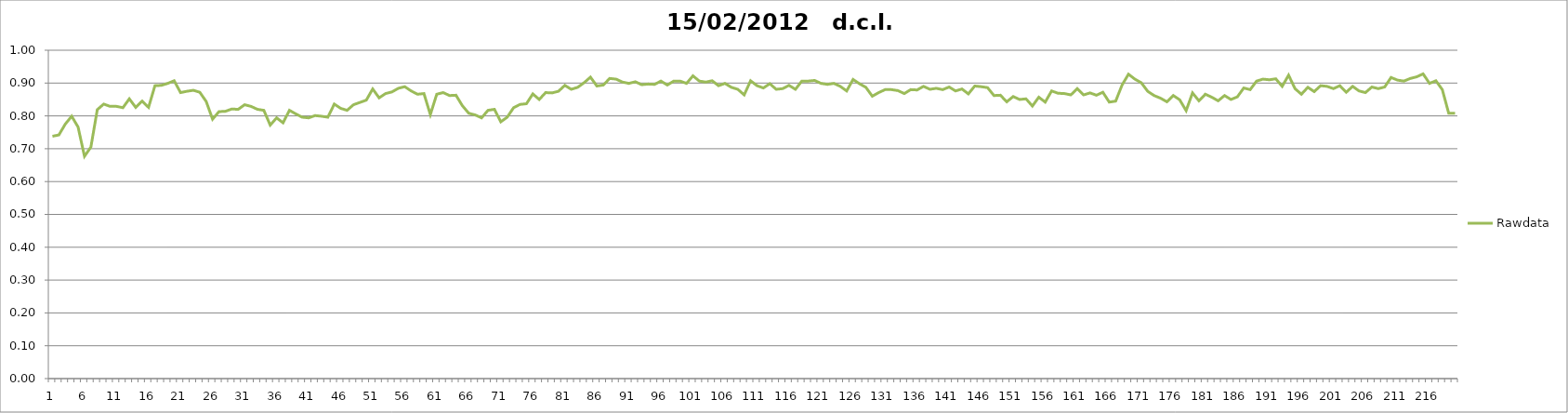
| Category | Rawdata |
|---|---|
| 0 | 0.738 |
| 1 | 0.742 |
| 2 | 0.775 |
| 3 | 0.799 |
| 4 | 0.766 |
| 5 | 0.677 |
| 6 | 0.705 |
| 7 | 0.819 |
| 8 | 0.836 |
| 9 | 0.829 |
| 10 | 0.829 |
| 11 | 0.825 |
| 12 | 0.852 |
| 13 | 0.826 |
| 14 | 0.845 |
| 15 | 0.826 |
| 16 | 0.892 |
| 17 | 0.893 |
| 18 | 0.899 |
| 19 | 0.907 |
| 20 | 0.871 |
| 21 | 0.875 |
| 22 | 0.878 |
| 23 | 0.872 |
| 24 | 0.844 |
| 25 | 0.79 |
| 26 | 0.813 |
| 27 | 0.814 |
| 28 | 0.821 |
| 29 | 0.82 |
| 30 | 0.834 |
| 31 | 0.829 |
| 32 | 0.82 |
| 33 | 0.817 |
| 34 | 0.772 |
| 35 | 0.794 |
| 36 | 0.779 |
| 37 | 0.817 |
| 38 | 0.806 |
| 39 | 0.796 |
| 40 | 0.794 |
| 41 | 0.801 |
| 42 | 0.799 |
| 43 | 0.796 |
| 44 | 0.836 |
| 45 | 0.823 |
| 46 | 0.817 |
| 47 | 0.834 |
| 48 | 0.841 |
| 49 | 0.848 |
| 50 | 0.882 |
| 51 | 0.855 |
| 52 | 0.868 |
| 53 | 0.873 |
| 54 | 0.884 |
| 55 | 0.889 |
| 56 | 0.876 |
| 57 | 0.866 |
| 58 | 0.868 |
| 59 | 0.804 |
| 60 | 0.866 |
| 61 | 0.871 |
| 62 | 0.862 |
| 63 | 0.863 |
| 64 | 0.831 |
| 65 | 0.808 |
| 66 | 0.803 |
| 67 | 0.794 |
| 68 | 0.817 |
| 69 | 0.82 |
| 70 | 0.782 |
| 71 | 0.796 |
| 72 | 0.825 |
| 73 | 0.835 |
| 74 | 0.837 |
| 75 | 0.867 |
| 76 | 0.85 |
| 77 | 0.871 |
| 78 | 0.87 |
| 79 | 0.875 |
| 80 | 0.893 |
| 81 | 0.881 |
| 82 | 0.887 |
| 83 | 0.901 |
| 84 | 0.918 |
| 85 | 0.891 |
| 86 | 0.894 |
| 87 | 0.914 |
| 88 | 0.912 |
| 89 | 0.903 |
| 90 | 0.899 |
| 91 | 0.904 |
| 92 | 0.895 |
| 93 | 0.897 |
| 94 | 0.896 |
| 95 | 0.906 |
| 96 | 0.894 |
| 97 | 0.906 |
| 98 | 0.906 |
| 99 | 0.899 |
| 100 | 0.922 |
| 101 | 0.906 |
| 102 | 0.903 |
| 103 | 0.907 |
| 104 | 0.892 |
| 105 | 0.899 |
| 106 | 0.887 |
| 107 | 0.881 |
| 108 | 0.864 |
| 109 | 0.907 |
| 110 | 0.892 |
| 111 | 0.885 |
| 112 | 0.898 |
| 113 | 0.881 |
| 114 | 0.883 |
| 115 | 0.893 |
| 116 | 0.881 |
| 117 | 0.906 |
| 118 | 0.906 |
| 119 | 0.908 |
| 120 | 0.899 |
| 121 | 0.896 |
| 122 | 0.899 |
| 123 | 0.89 |
| 124 | 0.876 |
| 125 | 0.911 |
| 126 | 0.898 |
| 127 | 0.887 |
| 128 | 0.86 |
| 129 | 0.871 |
| 130 | 0.88 |
| 131 | 0.88 |
| 132 | 0.877 |
| 133 | 0.868 |
| 134 | 0.88 |
| 135 | 0.879 |
| 136 | 0.89 |
| 137 | 0.881 |
| 138 | 0.884 |
| 139 | 0.88 |
| 140 | 0.888 |
| 141 | 0.876 |
| 142 | 0.882 |
| 143 | 0.867 |
| 144 | 0.891 |
| 145 | 0.889 |
| 146 | 0.886 |
| 147 | 0.862 |
| 148 | 0.863 |
| 149 | 0.843 |
| 150 | 0.859 |
| 151 | 0.85 |
| 152 | 0.852 |
| 153 | 0.83 |
| 154 | 0.857 |
| 155 | 0.842 |
| 156 | 0.876 |
| 157 | 0.869 |
| 158 | 0.868 |
| 159 | 0.864 |
| 160 | 0.883 |
| 161 | 0.864 |
| 162 | 0.87 |
| 163 | 0.863 |
| 164 | 0.872 |
| 165 | 0.842 |
| 166 | 0.845 |
| 167 | 0.894 |
| 168 | 0.927 |
| 169 | 0.912 |
| 170 | 0.901 |
| 171 | 0.875 |
| 172 | 0.862 |
| 173 | 0.854 |
| 174 | 0.843 |
| 175 | 0.862 |
| 176 | 0.849 |
| 177 | 0.816 |
| 178 | 0.87 |
| 179 | 0.846 |
| 180 | 0.866 |
| 181 | 0.857 |
| 182 | 0.846 |
| 183 | 0.862 |
| 184 | 0.85 |
| 185 | 0.858 |
| 186 | 0.885 |
| 187 | 0.88 |
| 188 | 0.906 |
| 189 | 0.912 |
| 190 | 0.91 |
| 191 | 0.913 |
| 192 | 0.89 |
| 193 | 0.924 |
| 194 | 0.883 |
| 195 | 0.866 |
| 196 | 0.887 |
| 197 | 0.874 |
| 198 | 0.892 |
| 199 | 0.89 |
| 200 | 0.883 |
| 201 | 0.892 |
| 202 | 0.872 |
| 203 | 0.89 |
| 204 | 0.876 |
| 205 | 0.871 |
| 206 | 0.888 |
| 207 | 0.883 |
| 208 | 0.888 |
| 209 | 0.917 |
| 210 | 0.909 |
| 211 | 0.906 |
| 212 | 0.914 |
| 213 | 0.919 |
| 214 | 0.928 |
| 215 | 0.899 |
| 216 | 0.907 |
| 217 | 0.88 |
| 218 | 0.808 |
| 219 | 0.808 |